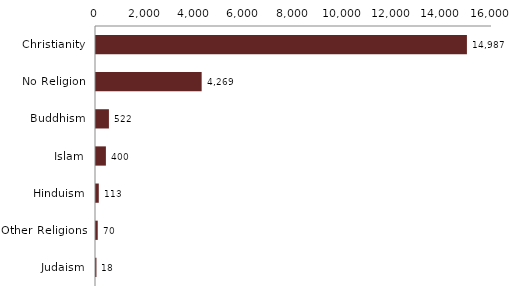
| Category | Series 0 |
|---|---|
| Christianity | 14987 |
| No Religion | 4269 |
| Buddhism | 522 |
| Islam | 400 |
| Hinduism | 113 |
| Other Religions | 70 |
| Judaism | 18 |